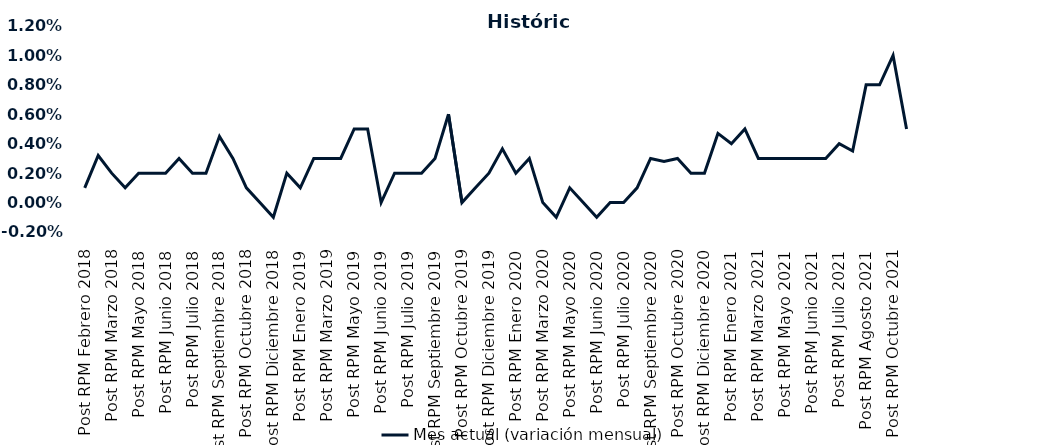
| Category | Mes actual (variación mensual)  |
|---|---|
| Post RPM Febrero 2018 | 0.001 |
| Pre RPM Marzo 2018 | 0.003 |
| Post RPM Marzo 2018 | 0.002 |
| Pre RPM Mayo 2018 | 0.001 |
| Post RPM Mayo 2018 | 0.002 |
| Pre RPM Junio 2018 | 0.002 |
| Post RPM Junio 2018 | 0.002 |
| Pre RPM Julio 2018 | 0.003 |
| Post RPM Julio 2018 | 0.002 |
| Pre RPM Septiembre 2018 | 0.002 |
| Post RPM Septiembre 2018 | 0.004 |
| Pre RPM Octubre 2018 | 0.003 |
| Post RPM Octubre 2018 | 0.001 |
| Pre RPM Diciembre 2018 | 0 |
| Post RPM Diciembre 2018 | -0.001 |
| Pre RPM Enero 2019 | 0.002 |
| Post RPM Enero 2019 | 0.001 |
| Pre RPM Marzo 2019 | 0.003 |
| Post RPM Marzo 2019 | 0.003 |
| Pre RPM Mayo 2019 | 0.003 |
| Post RPM Mayo 2019 | 0.005 |
| Pre RPM Junio 2019 | 0.005 |
| Post RPM Junio 2019 | 0 |
| Pre RPM Julio 2019 | 0.002 |
| Post RPM Julio 2019 | 0.002 |
| Pre RPM Septiembre 2019 | 0.002 |
| Post RPM Septiembre 2019 | 0.003 |
| Pre RPM Octubre 2019 | 0.006 |
| Post RPM Octubre 2019 | 0 |
| Pre RPM Diciembre 2019 | 0.001 |
| Post RPM Diciembre 2019 | 0.002 |
| Pre RPM Enero 2020 | 0.004 |
| Post RPM Enero 2020 | 0.002 |
| Pre RPM Marzo 2020 | 0.003 |
| Post RPM Marzo 2020 | 0 |
| Pre RPM Mayo 2020 | -0.001 |
| Post RPM Mayo 2020 | 0.001 |
| Pre RPM Junio 2020 | 0 |
| Post RPM Junio 2020 | -0.001 |
| Pre RPM Julio 2020 | 0 |
| Post RPM Julio 2020 | 0 |
| Pre RPM Septiembre 2020 | 0.001 |
| Post RPM Septiembre 2020 | 0.003 |
| Pre RPM Octubre 2020 | 0.003 |
| Post RPM Octubre 2020 | 0.003 |
| Pre RPM Diciembre 2020 | 0.002 |
| Post RPM Diciembre 2020 | 0.002 |
| Pre RPM Enero 2021 | 0.005 |
| Post RPM Enero 2021 | 0.004 |
| Pre RPM Marzo 2021 | 0.005 |
| Post RPM Marzo 2021 | 0.003 |
| Pre RPM Mayo 2021 | 0.003 |
| Post RPM Mayo 2021 | 0.003 |
| Pre RPM Junio 2021 | 0.003 |
| Post RPM Junio 2021 | 0.003 |
| Pre RPM Julio 2021 | 0.003 |
| Post RPM Julio 2021 | 0.004 |
| Pre RPM Agosto 2021 | 0.004 |
| Post RPM Agosto 2021 | 0.008 |
| Pre RPM Octubre 2021 | 0.008 |
| Post RPM Octubre 2021 | 0.01 |
| Pre RPM Diciembre 2021 | 0.005 |